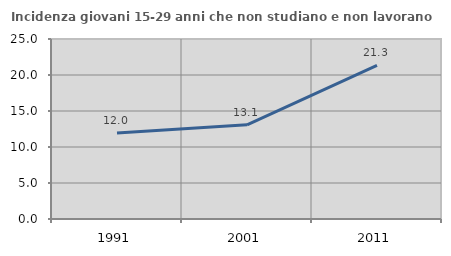
| Category | Incidenza giovani 15-29 anni che non studiano e non lavorano  |
|---|---|
| 1991.0 | 11.96 |
| 2001.0 | 13.084 |
| 2011.0 | 21.338 |